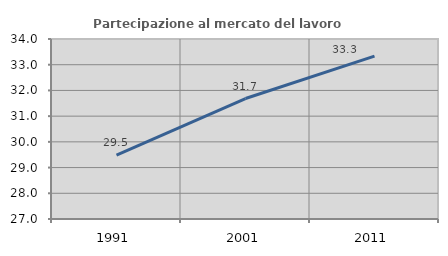
| Category | Partecipazione al mercato del lavoro  femminile |
|---|---|
| 1991.0 | 29.484 |
| 2001.0 | 31.685 |
| 2011.0 | 33.333 |